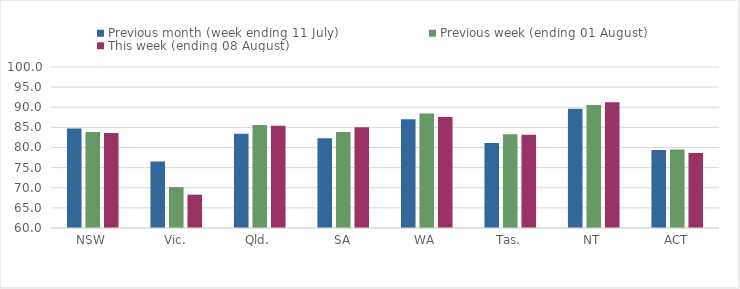
| Category | Previous month (week ending 11 July) | Previous week (ending 01 August) | This week (ending 08 August) |
|---|---|---|---|
| NSW | 84.741 | 83.846 | 83.6 |
| Vic. | 76.5 | 70.158 | 68.281 |
| Qld. | 83.406 | 85.596 | 85.433 |
| SA | 82.317 | 83.863 | 85.05 |
| WA | 87.004 | 88.419 | 87.571 |
| Tas. | 81.106 | 83.275 | 83.168 |
| NT | 89.61 | 90.585 | 91.26 |
| ACT | 79.359 | 79.523 | 78.651 |